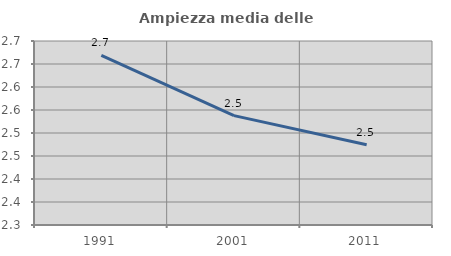
| Category | Ampiezza media delle famiglie |
|---|---|
| 1991.0 | 2.669 |
| 2001.0 | 2.538 |
| 2011.0 | 2.475 |